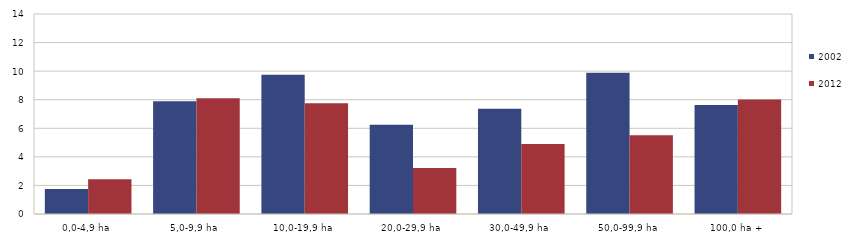
| Category | 2002 | 2012 |
|---|---|---|
| 0,0-4,9 ha | 1.757 | 2.435 |
| 5,0-9,9 ha | 7.893 | 8.097 |
| 10,0-19,9 ha | 9.752 | 7.752 |
| 20,0-29,9 ha | 6.256 | 3.22 |
| 30,0-49,9 ha | 7.369 | 4.894 |
| 50,0-99,9 ha | 9.88 | 5.516 |
| 100,0 ha + | 7.623 | 8.015 |